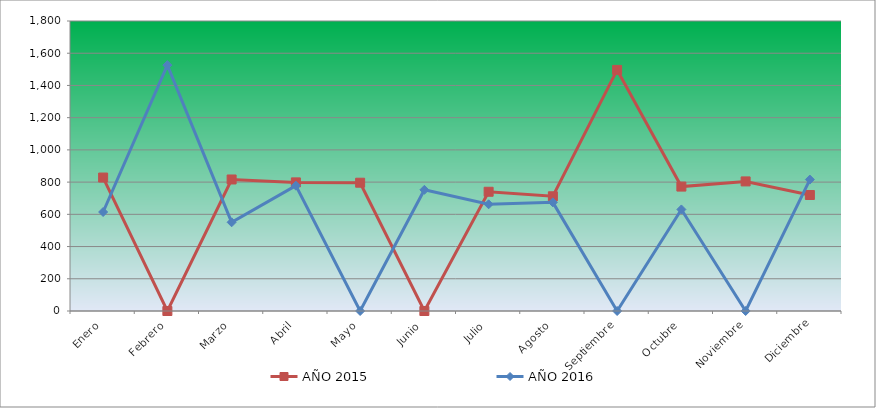
| Category | AÑO 2015 | AÑO 2016 |
|---|---|---|
| Enero | 828.377 | 614.428 |
| Febrero | 0 | 1526.096 |
| Marzo | 816.343 | 550.591 |
| Abril | 798.291 | 778.01 |
| Mayo | 796.285 | 0 |
| Junio | 0 | 752.076 |
| Julio | 740.124 | 662.306 |
| Agosto | 712.043 | 674.275 |
| Septiembre | 1496.294 | 0 |
| Octubre | 772.216 | 630.387 |
| Noviembre | 804.308 | 0 |
| Diciembre | 720.066 | 815.913 |